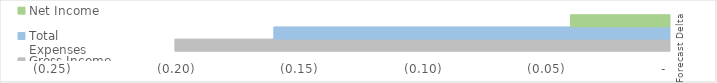
| Category | Gross Income | Total Expenses | Net Income |
|---|---|---|---|
| Forecast Delta | -0.2 | -0.16 | -0.04 |